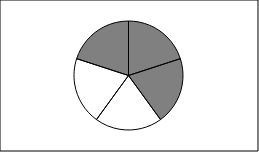
| Category | Series 0 | Series 1 |
|---|---|---|
| 0 | 1 |  |
| 1 | 1 |  |
| 2 | 1 |  |
| 3 | 1 |  |
| 4 | 1 |  |